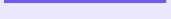
| Category | Series 0 | Series 1 |
|---|---|---|
| 0 | 0.997 | 0.003 |